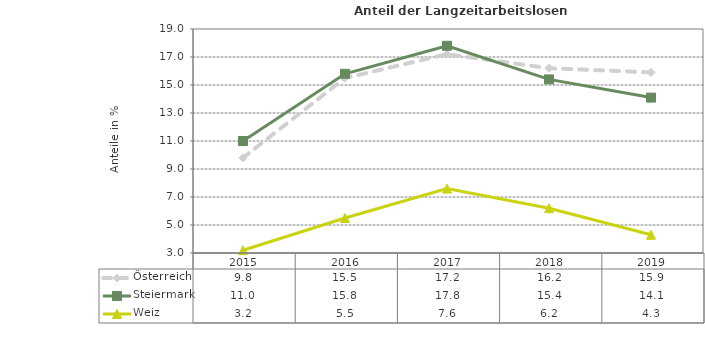
| Category | Österreich | Steiermark | Weiz |
|---|---|---|---|
| 2019.0 | 15.9 | 14.1 | 4.3 |
| 2018.0 | 16.2 | 15.4 | 6.2 |
| 2017.0 | 17.2 | 17.8 | 7.6 |
| 2016.0 | 15.5 | 15.8 | 5.5 |
| 2015.0 | 9.8 | 11 | 3.2 |